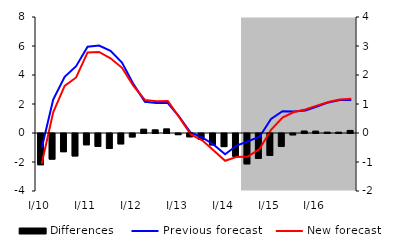
| Category | Differences |
|---|---|
| 0 | -1.077 |
| 1 | -0.884 |
| 2 | -0.628 |
| 3 | -0.773 |
| 4 | -0.389 |
| 5 | -0.442 |
| 6 | -0.515 |
| 7 | -0.357 |
| 8 | -0.119 |
| 9 | 0.132 |
| 10 | 0.111 |
| 11 | 0.144 |
| 12 | -0.04 |
| 13 | -0.113 |
| 14 | -0.199 |
| 15 | -0.394 |
| 16 | -0.452 |
| 17 | -0.783 |
| 18 | -1.046 |
| 19 | -0.857 |
| 20 | -0.755 |
| 21 | -0.442 |
| 22 | -0.046 |
| 23 | 0.07 |
| 24 | 0.066 |
| 25 | 0.031 |
| 26 | 0.029 |
| 27 | 0.089 |